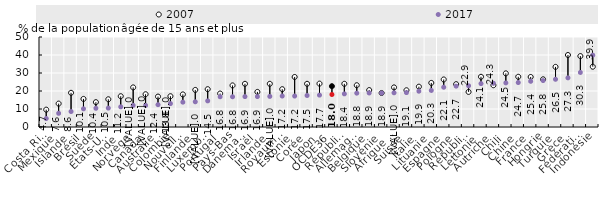
| Category | 2007 | 2017 |
|---|---|---|
| Costa Rica | 9.64 | 4.7 |
| Mexique | 13 | 7.6 |
| Islande | 19 | 8.6 |
| Brésil | 15.6 | 10.1 |
| Suède | 13.8 | 10.4 |
| États-Unis | 15.4 | 10.5 |
| Inde | 17.1 | 11.2 |
| Norvège | 22 | 12 |
| Canada | 18.2 | 12 |
| Australie | 16.9 | 12.4 |
| Colombie | 17.1 | 13 |
| Nouvelle-Zélande | 18.1 | 13.8 |
| Finlande | 20.6 | 14 |
| Luxembourg | 21 | 14.5 |
| Portugal | 18.6 | 16.8 |
| Pays-Bas | 23.1 | 16.8 |
| Danemark | 24 | 16.9 |
| Israël | 19.5 | 16.9 |
| Irlande | 24 | 17 |
| Royaume-Uni | 21 | 17.2 |
| Estonie | 27.8 | 17.2 |
| Corée | 24 | 17.5 |
| Japon | 24.1 | 17.7 |
| OCDE36 | 22.675 | 18.047 |
| République tchèque | 24 | 18.4 |
| Allemagne | 23.2 | 18.8 |
| Belgique | 20.5 | 18.9 |
| Slovénie | 18.9 | 18.9 |
| Afrique du Sud | 22 | 19 |
| Suisse | 20.4 | 19.1 |
| Italie | 22.4 | 19.9 |
| Lituanie | 24.5 | 20.3 |
| Espagne | 26.4 | 22.1 |
| Pologne | 23.8 | 22.7 |
| République slovaque | 19.5 | 22.9 |
| Lettonie | 27.9 | 24.1 |
| Autriche | 23.2 | 24.3 |
| Chili | 29.8 | 24.5 |
| Chine | 27.9 | 24.7 |
| France | 27.8 | 25.4 |
| Hongrie | 26.5 | 25.8 |
| Turquie | 33.4 | 26.5 |
| Grèce | 40 | 27.3 |
| Fédération de Russie | 39.4 | 30.3 |
| Indonésie | 33.5 | 39.9 |